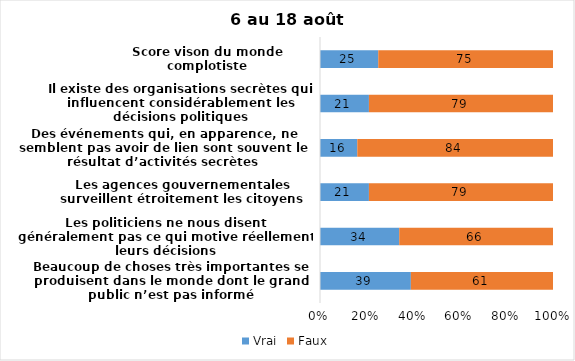
| Category | Vrai | Faux |
|---|---|---|
| Beaucoup de choses très importantes se produisent dans le monde dont le grand public n’est pas informé | 39 | 61 |
| Les politiciens ne nous disent généralement pas ce qui motive réellement leurs décisions | 34 | 66 |
| Les agences gouvernementales surveillent étroitement les citoyens | 21 | 79 |
| Des événements qui, en apparence, ne semblent pas avoir de lien sont souvent le résultat d’activités secrètes | 16 | 84 |
| Il existe des organisations secrètes qui influencent considérablement les décisions politiques | 21 | 79 |
| Score vison du monde complotiste | 25 | 75 |